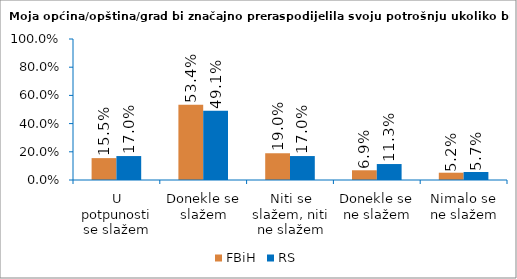
| Category | FBiH | RS |
|---|---|---|
| U potpunosti se slažem | 0.155 | 0.17 |
| Donekle se slažem | 0.534 | 0.491 |
| Niti se slažem, niti ne slažem | 0.19 | 0.17 |
| Donekle se ne slažem | 0.069 | 0.113 |
| Nimalo se ne slažem | 0.052 | 0.057 |